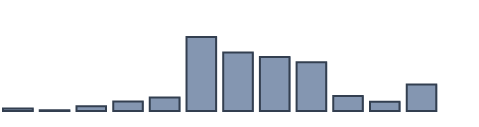
| Category | Series 0 |
|---|---|
| 0 | 0.776 |
| 1 | 0.274 |
| 2 | 1.52 |
| 3 | 3.034 |
| 4 | 4.296 |
| 5 | 23.333 |
| 6 | 18.437 |
| 7 | 17.009 |
| 8 | 15.352 |
| 9 | 4.692 |
| 10 | 2.934 |
| 11 | 8.341 |
| 12 | 0 |